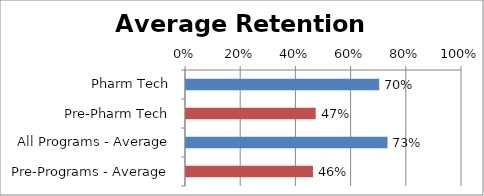
| Category | Series 0 |
|---|---|
| Pharm Tech | 0.7 |
| Pre-Pharm Tech | 0.47 |
| All Programs - Average | 0.73 |
| Pre-Programs - Average | 0.46 |